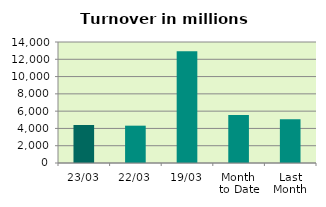
| Category | Series 0 |
|---|---|
| 23/03 | 4398.411 |
| 22/03 | 4319.016 |
| 19/03 | 12932.432 |
| Month 
to Date | 5562.617 |
| Last
Month | 5069.383 |